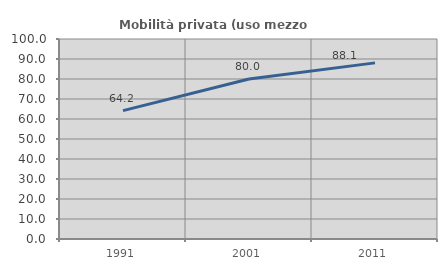
| Category | Mobilità privata (uso mezzo privato) |
|---|---|
| 1991.0 | 64.179 |
| 2001.0 | 80 |
| 2011.0 | 88.06 |